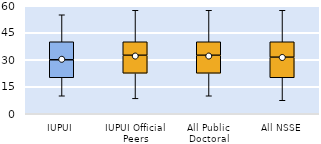
| Category | 25th | 50th | 75th |
|---|---|---|---|
| IUPUI | 20 | 10 | 10 |
| IUPUI Official Peers | 22.5 | 10 | 7.5 |
| All Public Doctoral | 22.5 | 10 | 7.5 |
| All NSSE | 20 | 11.429 | 8.571 |